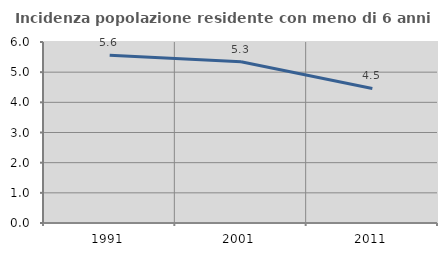
| Category | Incidenza popolazione residente con meno di 6 anni |
|---|---|
| 1991.0 | 5.559 |
| 2001.0 | 5.344 |
| 2011.0 | 4.461 |